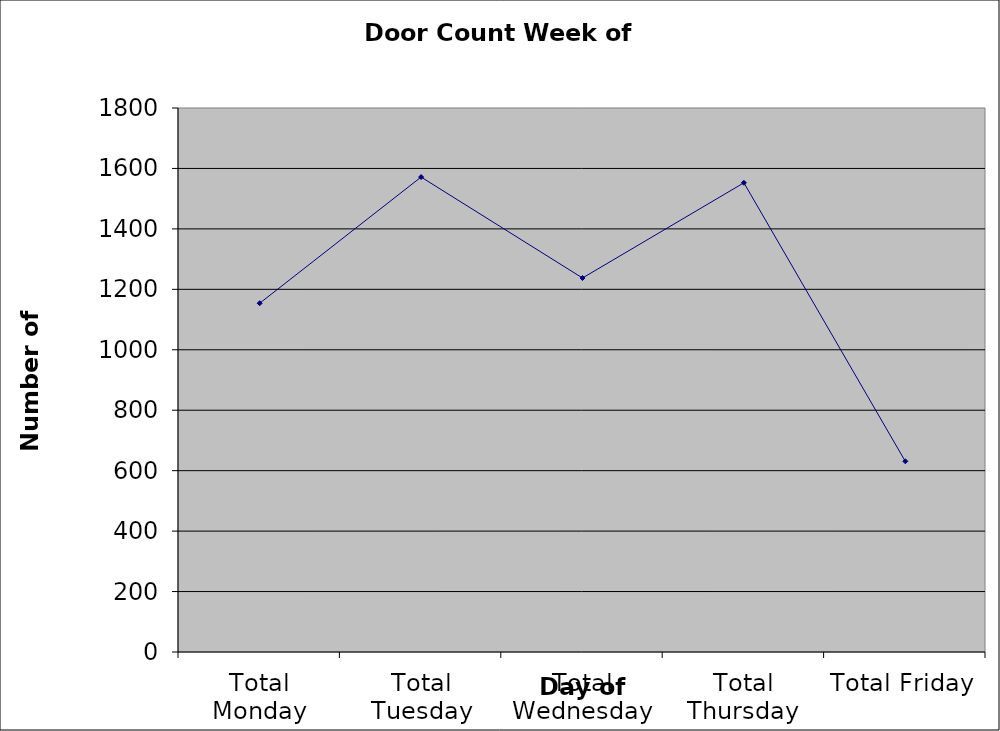
| Category | Series 0 |
|---|---|
| Total Monday | 1154 |
| Total Tuesday | 1571.5 |
| Total Wednesday | 1237.5 |
| Total Thursday | 1552.5 |
| Total Friday | 631 |